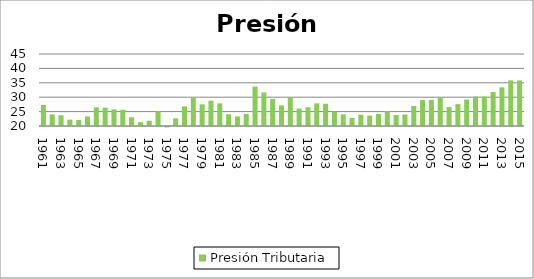
| Category | Presión Tributaria |
|---|---|
| 1961.0 | 27.33 |
| 1962.0 | 24.01 |
| 1963.0 | 23.71 |
| 1964.0 | 22.2 |
| 1965.0 | 22.09 |
| 1966.0 | 23.34 |
| 1967.0 | 26.48 |
| 1968.0 | 26.36 |
| 1969.0 | 25.78 |
| 1970.0 | 25.65 |
| 1971.0 | 23.02 |
| 1972.0 | 21.34 |
| 1973.0 | 21.83 |
| 1974.0 | 25.18 |
| 1975.0 | 19.5 |
| 1976.0 | 22.67 |
| 1977.0 | 26.8 |
| 1978.0 | 29.83 |
| 1979.0 | 27.54 |
| 1980.0 | 28.8 |
| 1981.0 | 27.85 |
| 1982.0 | 24.08 |
| 1983.0 | 23.32 |
| 1984.0 | 24.21 |
| 1985.0 | 33.68 |
| 1986.0 | 31.66 |
| 1987.0 | 29.41 |
| 1988.0 | 27.17 |
| 1989.0 | 29.84 |
| 1990.0 | 26.07 |
| 1991.0 | 26.49 |
| 1992.0 | 27.85 |
| 1993.0 | 27.71 |
| 1994.0 | 25.06 |
| 1995.0 | 24.04 |
| 1996.0 | 22.77 |
| 1997.0 | 23.92 |
| 1998.0 | 23.61 |
| 1999.0 | 24.21 |
| 2000.0 | 25.18 |
| 2001.0 | 23.8 |
| 2002.0 | 23.99 |
| 2003.0 | 26.96 |
| 2004.0 | 29.03 |
| 2005.0 | 29.06 |
| 2006.0 | 29.89 |
| 2007.0 | 26.573 |
| 2008.0 | 27.596 |
| 2009.0 | 29.191 |
| 2010.0 | 30.252 |
| 2011.0 | 30.253 |
| 2012.0 | 31.811 |
| 2013.0 | 33.443 |
| 2014.0 | 35.847 |
| 2015.0 | 35.847 |